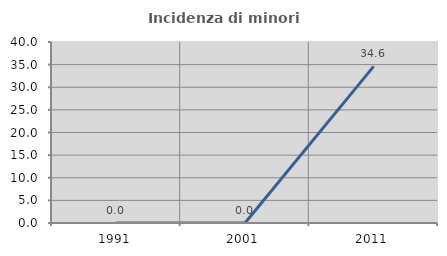
| Category | Incidenza di minori stranieri |
|---|---|
| 1991.0 | 0 |
| 2001.0 | 0 |
| 2011.0 | 34.615 |